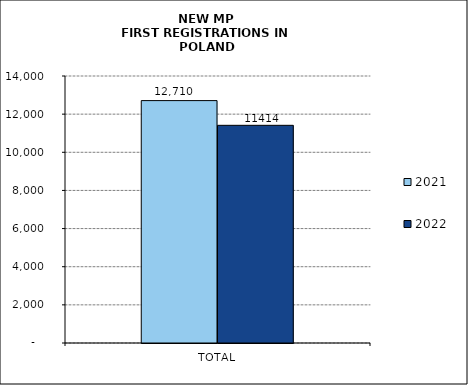
| Category | 2021 | 2022 |
|---|---|---|
| TOTAL | 12710 | 11414 |